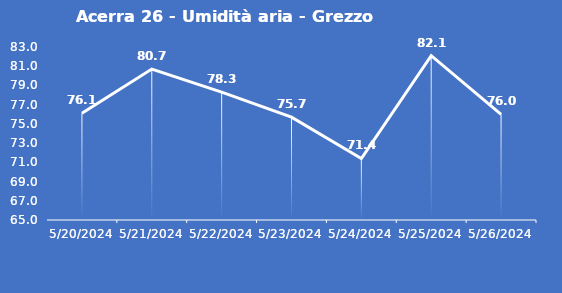
| Category | Acerra 26 - Umidità aria - Grezzo (%) |
|---|---|
| 5/20/24 | 76.1 |
| 5/21/24 | 80.7 |
| 5/22/24 | 78.3 |
| 5/23/24 | 75.7 |
| 5/24/24 | 71.4 |
| 5/25/24 | 82.1 |
| 5/26/24 | 76 |